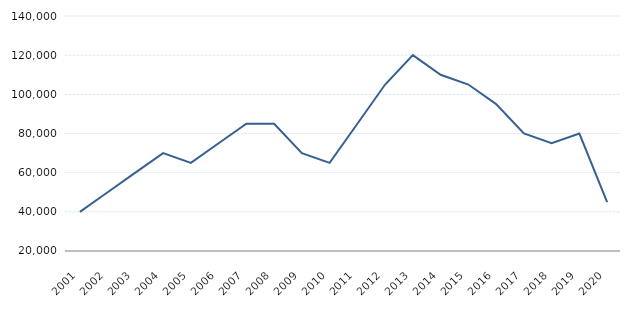
| Category | Série nova |
|---|---|
| 2001.0 | 40000 |
| 2002.0 | 50000 |
| 2003.0 | 60000 |
| 2004.0 | 70000 |
| 2005.0 | 65000 |
| 2006.0 | 75000 |
| 2007.0 | 85000 |
| 2008.0 | 85000 |
| 2009.0 | 70000 |
| 2010.0 | 65000 |
| 2011.0 | 85000 |
| 2012.0 | 105000 |
| 2013.0 | 120000 |
| 2014.0 | 110000 |
| 2015.0 | 105000 |
| 2016.0 | 95000 |
| 2017.0 | 80000 |
| 2018.0 | 75000 |
| 2019.0 | 80000 |
| 2020.0 | 45000 |